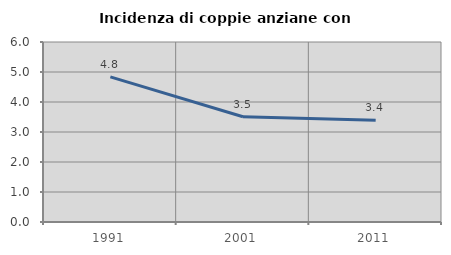
| Category | Incidenza di coppie anziane con figli |
|---|---|
| 1991.0 | 4.839 |
| 2001.0 | 3.509 |
| 2011.0 | 3.39 |